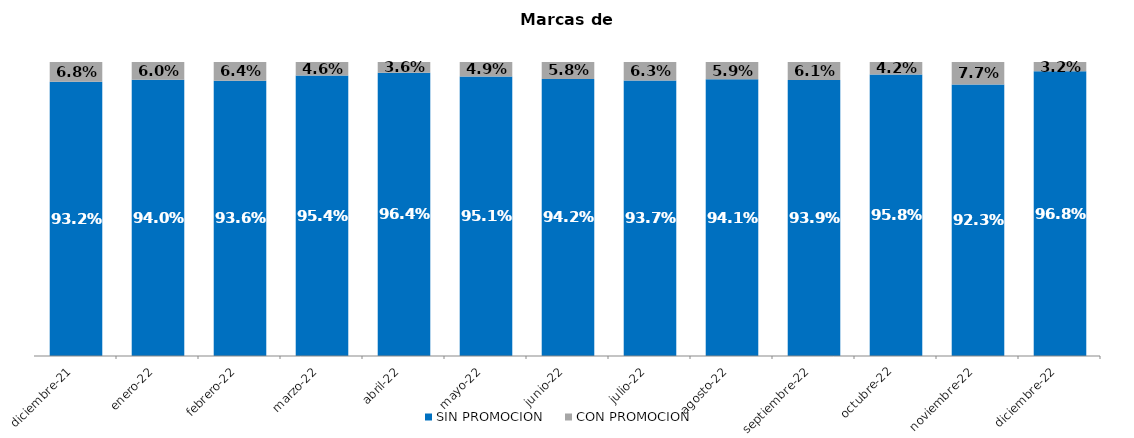
| Category | SIN PROMOCION   | CON PROMOCION   |
|---|---|---|
| 2021-12-01 | 0.932 | 0.068 |
| 2022-01-01 | 0.94 | 0.06 |
| 2022-02-01 | 0.936 | 0.064 |
| 2022-03-01 | 0.954 | 0.046 |
| 2022-04-01 | 0.964 | 0.036 |
| 2022-05-01 | 0.951 | 0.049 |
| 2022-06-01 | 0.942 | 0.058 |
| 2022-07-01 | 0.937 | 0.063 |
| 2022-08-01 | 0.941 | 0.059 |
| 2022-09-01 | 0.939 | 0.061 |
| 2022-10-01 | 0.958 | 0.042 |
| 2022-11-01 | 0.923 | 0.077 |
| 2022-12-01 | 0.968 | 0.032 |